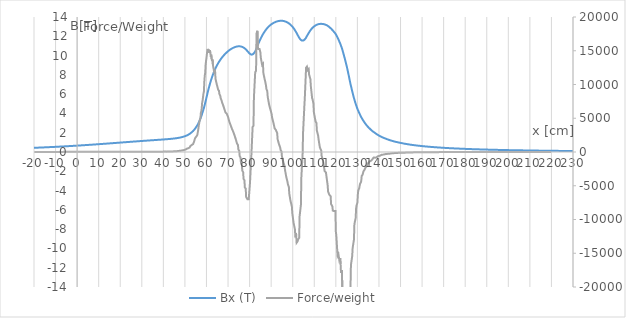
| Category | Bx (T) |
|---|---|
| -20.0 | 0.434 |
| -19.799999 | 0.436 |
| -19.6 | 0.438 |
| -19.4 | 0.44 |
| -19.200001 | 0.442 |
| -19.0 | 0.444 |
| -18.799999 | 0.446 |
| -18.6 | 0.447 |
| -18.4 | 0.449 |
| -18.200001 | 0.451 |
| -18.0 | 0.453 |
| -17.799999 | 0.455 |
| -17.6 | 0.457 |
| -17.4 | 0.459 |
| -17.200001 | 0.461 |
| -17.0 | 0.463 |
| -16.799999 | 0.465 |
| -16.6 | 0.467 |
| -16.4 | 0.469 |
| -16.200001 | 0.471 |
| -16.0 | 0.472 |
| -15.8 | 0.474 |
| -15.6 | 0.476 |
| -15.404266 | 0.478 |
| -15.2 | 0.48 |
| -15.0 | 0.483 |
| -14.8 | 0.485 |
| -14.6 | 0.487 |
| -14.4 | 0.489 |
| -14.2 | 0.49 |
| -14.0 | 0.493 |
| -13.8 | 0.495 |
| -13.6 | 0.497 |
| -13.4 | 0.499 |
| -13.2 | 0.501 |
| -12.999469 | 0.503 |
| -12.8 | 0.505 |
| -12.599999 | 0.507 |
| -12.4 | 0.51 |
| -12.2 | 0.512 |
| -12.0 | 0.514 |
| -11.8 | 0.516 |
| -11.599999 | 0.518 |
| -11.4 | 0.52 |
| -11.2 | 0.522 |
| -11.0 | 0.525 |
| -10.8 | 0.527 |
| -10.599999 | 0.529 |
| -10.4 | 0.531 |
| -10.2 | 0.534 |
| -10.0 | 0.536 |
| -9.8000002 | 0.538 |
| -9.5999994 | 0.54 |
| -9.3999996 | 0.543 |
| -9.1999998 | 0.545 |
| -9.0 | 0.547 |
| -8.8000002 | 0.55 |
| -8.5998316 | 0.552 |
| -8.3999996 | 0.554 |
| -8.1999998 | 0.557 |
| -8.0 | 0.559 |
| -7.7999997 | 0.561 |
| -7.5980721 | 0.564 |
| -7.3999996 | 0.566 |
| -7.1999998 | 0.568 |
| -7.0 | 0.571 |
| -6.7999997 | 0.573 |
| -6.5999999 | 0.576 |
| -6.3999996 | 0.578 |
| -6.1999998 | 0.58 |
| -6.0 | 0.583 |
| -5.7999997 | 0.585 |
| -5.5999999 | 0.588 |
| -5.3999996 | 0.59 |
| -5.1999998 | 0.593 |
| -5.0 | 0.595 |
| -4.7999997 | 0.598 |
| -4.5999999 | 0.6 |
| -4.3999996 | 0.603 |
| -4.1999998 | 0.605 |
| -3.9999998 | 0.608 |
| -3.7999997 | 0.611 |
| -3.5999997 | 0.613 |
| -3.3999999 | 0.616 |
| -3.1999998 | 0.618 |
| -2.9999998 | 0.621 |
| -2.7999997 | 0.623 |
| -2.5999997 | 0.626 |
| -2.3999996 | 0.629 |
| -2.1999998 | 0.631 |
| -1.9999998 | 0.634 |
| -1.7999997 | 0.637 |
| -1.5999997 | 0.639 |
| -1.3999997 | 0.642 |
| -1.1999997 | 0.645 |
| -0.9999997 | 0.647 |
| -0.79999971 | 0.65 |
| -0.59999973 | 0.653 |
| -0.39999971 | 0.655 |
| -0.1999997 | 0.658 |
| 0.0 | 0.661 |
| 0.2000003 | 0.664 |
| 0.4000003 | 0.666 |
| 0.60000032 | 0.669 |
| 0.80000031 | 0.672 |
| 1.0000004 | 0.675 |
| 1.2000003 | 0.678 |
| 1.4000003 | 0.68 |
| 1.6000004 | 0.683 |
| 1.8000003 | 0.686 |
| 2.0000002 | 0.689 |
| 2.2000003 | 0.692 |
| 2.4000003 | 0.695 |
| 2.6000004 | 0.697 |
| 2.8000004 | 0.7 |
| 3.0000002 | 0.703 |
| 3.2000003 | 0.706 |
| 3.4000003 | 0.709 |
| 3.6000004 | 0.712 |
| 3.8000004 | 0.715 |
| 4.0000005 | 0.718 |
| 4.2000003 | 0.721 |
| 4.4000006 | 0.724 |
| 4.6000004 | 0.727 |
| 4.8000002 | 0.73 |
| 4.9998217 | 0.733 |
| 5.2000003 | 0.736 |
| 5.4000006 | 0.739 |
| 5.6000004 | 0.742 |
| 5.8000002 | 0.745 |
| 6.0000005 | 0.748 |
| 6.2000003 | 0.751 |
| 6.4000006 | 0.754 |
| 6.6000004 | 0.757 |
| 6.8000002 | 0.76 |
| 7.0000005 | 0.763 |
| 7.2000003 | 0.766 |
| 7.4000006 | 0.769 |
| 7.6000004 | 0.772 |
| 7.8000002 | 0.775 |
| 8.0 | 0.778 |
| 8.2000008 | 0.781 |
| 8.4000006 | 0.784 |
| 8.6000004 | 0.788 |
| 8.8000002 | 0.791 |
| 9.0 | 0.794 |
| 9.2000008 | 0.797 |
| 9.4000006 | 0.801 |
| 9.6000004 | 0.804 |
| 9.8000002 | 0.807 |
| 10.0 | 0.81 |
| 10.200001 | 0.813 |
| 10.400001 | 0.816 |
| 10.6 | 0.819 |
| 10.8 | 0.823 |
| 11.0 | 0.826 |
| 11.200001 | 0.829 |
| 11.400001 | 0.832 |
| 11.6 | 0.835 |
| 11.8 | 0.839 |
| 12.0 | 0.842 |
| 12.200001 | 0.845 |
| 12.400001 | 0.848 |
| 12.6 | 0.852 |
| 12.8 | 0.855 |
| 13.000001 | 0.858 |
| 13.202733 | 0.862 |
| 13.400001 | 0.865 |
| 13.6 | 0.868 |
| 13.8 | 0.872 |
| 14.000001 | 0.875 |
| 14.200001 | 0.878 |
| 14.400001 | 0.882 |
| 14.6 | 0.885 |
| 14.8 | 0.888 |
| 15.000001 | 0.892 |
| 15.200001 | 0.895 |
| 15.400001 | 0.899 |
| 15.6 | 0.902 |
| 15.8 | 0.905 |
| 16.0 | 0.908 |
| 16.200001 | 0.912 |
| 16.4 | 0.915 |
| 16.6 | 0.918 |
| 16.800001 | 0.922 |
| 17.0 | 0.925 |
| 17.200001 | 0.928 |
| 17.4 | 0.932 |
| 17.6 | 0.935 |
| 17.800001 | 0.939 |
| 18.0 | 0.942 |
| 18.200001 | 0.946 |
| 18.400002 | 0.949 |
| 18.6 | 0.952 |
| 18.800001 | 0.956 |
| 19.0 | 0.959 |
| 19.200001 | 0.962 |
| 19.400002 | 0.965 |
| 19.6 | 0.969 |
| 19.800001 | 0.973 |
| 20.0 | 0.976 |
| 20.200001 | 0.979 |
| 20.400002 | 0.983 |
| 20.6 | 0.986 |
| 20.800001 | 0.989 |
| 21.0 | 0.993 |
| 21.200001 | 0.996 |
| 21.400002 | 0.999 |
| 21.6 | 1.003 |
| 21.800001 | 1.006 |
| 22.0 | 1.01 |
| 22.200001 | 1.013 |
| 22.400002 | 1.017 |
| 22.6 | 1.02 |
| 22.800001 | 1.023 |
| 23.0 | 1.027 |
| 23.200001 | 1.03 |
| 23.400002 | 1.033 |
| 23.6 | 1.036 |
| 23.800001 | 1.04 |
| 24.0 | 1.043 |
| 24.200001 | 1.047 |
| 24.400002 | 1.05 |
| 24.6 | 1.054 |
| 24.800001 | 1.057 |
| 25.0 | 1.06 |
| 25.200001 | 1.064 |
| 25.400002 | 1.067 |
| 25.603199 | 1.07 |
| 25.800001 | 1.074 |
| 26.0 | 1.077 |
| 26.200001 | 1.081 |
| 26.400002 | 1.084 |
| 26.6 | 1.087 |
| 26.800001 | 1.09 |
| 27.0 | 1.093 |
| 27.200001 | 1.097 |
| 27.400002 | 1.1 |
| 27.6 | 1.103 |
| 27.800001 | 1.107 |
| 28.0 | 1.11 |
| 28.200001 | 1.114 |
| 28.400002 | 1.117 |
| 28.6 | 1.12 |
| 28.800001 | 1.123 |
| 29.0 | 1.126 |
| 29.200001 | 1.13 |
| 29.400002 | 1.133 |
| 29.6 | 1.136 |
| 29.800001 | 1.14 |
| 30.0 | 1.143 |
| 30.200001 | 1.146 |
| 30.400002 | 1.149 |
| 30.6 | 1.153 |
| 30.800001 | 1.156 |
| 31.0 | 1.159 |
| 31.200001 | 1.162 |
| 31.400002 | 1.165 |
| 31.6 | 1.168 |
| 31.800001 | 1.171 |
| 32.0 | 1.175 |
| 32.200001 | 1.178 |
| 32.400002 | 1.181 |
| 32.600002 | 1.184 |
| 32.799999 | 1.187 |
| 33.0 | 1.191 |
| 33.200001 | 1.194 |
| 33.400002 | 1.197 |
| 33.600002 | 1.2 |
| 33.799999 | 1.203 |
| 34.0 | 1.206 |
| 34.200001 | 1.209 |
| 34.400002 | 1.212 |
| 34.600002 | 1.215 |
| 34.799999 | 1.219 |
| 35.0 | 1.222 |
| 35.200001 | 1.225 |
| 35.400002 | 1.228 |
| 35.600002 | 1.231 |
| 35.799999 | 1.234 |
| 36.0 | 1.237 |
| 36.200001 | 1.24 |
| 36.400002 | 1.243 |
| 36.600002 | 1.246 |
| 36.799999 | 1.249 |
| 37.0 | 1.252 |
| 37.200001 | 1.256 |
| 37.400002 | 1.259 |
| 37.600002 | 1.262 |
| 37.801914 | 1.265 |
| 38.0 | 1.268 |
| 38.200001 | 1.271 |
| 38.400002 | 1.274 |
| 38.600002 | 1.277 |
| 38.799999 | 1.28 |
| 39.0 | 1.283 |
| 39.200001 | 1.287 |
| 39.400002 | 1.29 |
| 39.600002 | 1.293 |
| 39.799999 | 1.296 |
| 40.0 | 1.299 |
| 40.200001 | 1.302 |
| 40.400002 | 1.306 |
| 40.600002 | 1.31 |
| 40.799999 | 1.313 |
| 41.0 | 1.317 |
| 41.200001 | 1.32 |
| 41.400002 | 1.323 |
| 41.600002 | 1.326 |
| 41.799999 | 1.33 |
| 42.0 | 1.334 |
| 42.200001 | 1.337 |
| 42.400002 | 1.341 |
| 42.600002 | 1.345 |
| 42.799999 | 1.35 |
| 43.0 | 1.353 |
| 43.200001 | 1.357 |
| 43.400002 | 1.362 |
| 43.600002 | 1.366 |
| 43.799999 | 1.371 |
| 44.0 | 1.375 |
| 44.200001 | 1.38 |
| 44.400002 | 1.385 |
| 44.600002 | 1.39 |
| 44.799999 | 1.395 |
| 45.0 | 1.401 |
| 45.200001 | 1.406 |
| 45.400002 | 1.412 |
| 45.600002 | 1.417 |
| 45.799999 | 1.423 |
| 46.0 | 1.429 |
| 46.200001 | 1.436 |
| 46.400002 | 1.442 |
| 46.600002 | 1.449 |
| 46.799999 | 1.457 |
| 47.0 | 1.465 |
| 47.200001 | 1.473 |
| 47.400002 | 1.481 |
| 47.600002 | 1.49 |
| 47.799999 | 1.499 |
| 48.0 | 1.509 |
| 48.194988 | 1.519 |
| 48.400002 | 1.53 |
| 48.600002 | 1.542 |
| 48.799999 | 1.554 |
| 49.0 | 1.566 |
| 49.200001 | 1.579 |
| 49.400002 | 1.593 |
| 49.600002 | 1.608 |
| 49.799999 | 1.623 |
| 50.0 | 1.639 |
| 50.200001 | 1.655 |
| 50.400002 | 1.672 |
| 50.600002 | 1.69 |
| 50.799999 | 1.708 |
| 51.0 | 1.731 |
| 51.200001 | 1.753 |
| 51.400002 | 1.776 |
| 51.600002 | 1.8 |
| 51.799999 | 1.824 |
| 52.0 | 1.851 |
| 52.200001 | 1.879 |
| 52.400002 | 1.91 |
| 52.600002 | 1.945 |
| 52.799999 | 1.981 |
| 53.0 | 2.019 |
| 53.200001 | 2.057 |
| 53.400002 | 2.096 |
| 53.600002 | 2.137 |
| 53.799999 | 2.178 |
| 54.0 | 2.224 |
| 54.200001 | 2.274 |
| 54.400002 | 2.324 |
| 54.600002 | 2.385 |
| 54.799999 | 2.45 |
| 55.0 | 2.515 |
| 55.200001 | 2.582 |
| 55.400002 | 2.649 |
| 55.600002 | 2.717 |
| 55.799999 | 2.788 |
| 56.0 | 2.859 |
| 56.200001 | 2.946 |
| 56.400002 | 3.043 |
| 56.600002 | 3.14 |
| 56.800003 | 3.248 |
| 57.0 | 3.357 |
| 57.200001 | 3.468 |
| 57.400002 | 3.591 |
| 57.600002 | 3.715 |
| 57.800003 | 3.843 |
| 58.0 | 3.984 |
| 58.200001 | 4.124 |
| 58.400002 | 4.269 |
| 58.600002 | 4.418 |
| 58.800003 | 4.567 |
| 59.0 | 4.734 |
| 59.200001 | 4.91 |
| 59.400002 | 5.085 |
| 59.600002 | 5.271 |
| 59.800003 | 5.459 |
| 60.000004 | 5.647 |
| 60.200001 | 5.837 |
| 60.400002 | 6.026 |
| 60.600002 | 6.214 |
| 60.800003 | 6.389 |
| 61.0 | 6.565 |
| 61.200001 | 6.737 |
| 61.400002 | 6.899 |
| 61.600002 | 7.061 |
| 61.800003 | 7.216 |
| 62.0 | 7.362 |
| 62.200001 | 7.508 |
| 62.400002 | 7.646 |
| 62.600002 | 7.778 |
| 62.800003 | 7.91 |
| 63.0 | 8.031 |
| 63.200001 | 8.15 |
| 63.400002 | 8.269 |
| 63.600002 | 8.376 |
| 63.800003 | 8.482 |
| 63.995033 | 8.586 |
| 64.200005 | 8.683 |
| 64.400002 | 8.778 |
| 64.599998 | 8.871 |
| 64.800003 | 8.956 |
| 65.0 | 9.041 |
| 65.200005 | 9.124 |
| 65.400002 | 9.201 |
| 65.599998 | 9.277 |
| 65.800003 | 9.351 |
| 66.0 | 9.42 |
| 66.200005 | 9.489 |
| 66.400002 | 9.556 |
| 66.599998 | 9.619 |
| 66.800003 | 9.682 |
| 67.0 | 9.741 |
| 67.200005 | 9.799 |
| 67.400002 | 9.856 |
| 67.599998 | 9.91 |
| 67.800003 | 9.963 |
| 68.0 | 10.015 |
| 68.200005 | 10.064 |
| 68.400002 | 10.111 |
| 68.599998 | 10.159 |
| 68.800003 | 10.203 |
| 69.0 | 10.246 |
| 69.200005 | 10.289 |
| 69.400002 | 10.331 |
| 69.599998 | 10.372 |
| 69.800003 | 10.414 |
| 70.0 | 10.452 |
| 70.200005 | 10.49 |
| 70.399872 | 10.527 |
| 70.599998 | 10.56 |
| 70.800003 | 10.592 |
| 71.0 | 10.624 |
| 71.200005 | 10.653 |
| 71.400002 | 10.681 |
| 71.599998 | 10.709 |
| 71.800003 | 10.734 |
| 72.0 | 10.758 |
| 72.200005 | 10.782 |
| 72.400002 | 10.803 |
| 72.599998 | 10.825 |
| 72.800003 | 10.845 |
| 73.0 | 10.863 |
| 73.200005 | 10.88 |
| 73.400002 | 10.896 |
| 73.599998 | 10.91 |
| 73.800003 | 10.923 |
| 74.0 | 10.935 |
| 74.200005 | 10.943 |
| 74.400002 | 10.952 |
| 74.599998 | 10.959 |
| 74.800003 | 10.962 |
| 75.0 | 10.964 |
| 75.200005 | 10.965 |
| 75.400002 | 10.961 |
| 75.599998 | 10.957 |
| 75.800003 | 10.951 |
| 76.0 | 10.94 |
| 76.200005 | 10.928 |
| 76.400002 | 10.915 |
| 76.599998 | 10.896 |
| 76.800003 | 10.877 |
| 77.0 | 10.856 |
| 77.200005 | 10.828 |
| 77.400002 | 10.8 |
| 77.599998 | 10.77 |
| 77.800003 | 10.733 |
| 78.0 | 10.695 |
| 78.200005 | 10.657 |
| 78.400002 | 10.609 |
| 78.599998 | 10.561 |
| 78.800003 | 10.513 |
| 79.0 | 10.462 |
| 79.200005 | 10.411 |
| 79.400002 | 10.36 |
| 79.599998 | 10.308 |
| 79.800003 | 10.256 |
| 80.000008 | 10.205 |
| 80.200005 | 10.171 |
| 80.400002 | 10.138 |
| 80.595566 | 10.105 |
| 80.800003 | 10.1 |
| 81.0 | 10.096 |
| 81.200005 | 10.092 |
| 81.400002 | 10.12 |
| 81.599998 | 10.148 |
| 81.800003 | 10.177 |
| 82.0 | 10.237 |
| 82.200005 | 10.297 |
| 82.395538 | 10.355 |
| 82.599998 | 10.443 |
| 82.800003 | 10.529 |
| 83.000008 | 10.616 |
| 83.200005 | 10.74 |
| 83.400002 | 10.865 |
| 83.599998 | 10.989 |
| 83.800003 | 11.096 |
| 84.0 | 11.2 |
| 84.200005 | 11.304 |
| 84.400002 | 11.406 |
| 84.599998 | 11.507 |
| 84.800003 | 11.608 |
| 85.0 | 11.704 |
| 85.200005 | 11.794 |
| 85.400002 | 11.884 |
| 85.599998 | 11.972 |
| 85.800003 | 12.054 |
| 86.0 | 12.135 |
| 86.19445 | 12.215 |
| 86.400002 | 12.289 |
| 86.599998 | 12.361 |
| 86.800003 | 12.434 |
| 87.0 | 12.499 |
| 87.200005 | 12.563 |
| 87.400002 | 12.627 |
| 87.599998 | 12.686 |
| 87.800003 | 12.742 |
| 88.0 | 12.798 |
| 88.200005 | 12.851 |
| 88.400002 | 12.899 |
| 88.599998 | 12.948 |
| 88.800003 | 12.996 |
| 89.0 | 13.037 |
| 89.200005 | 13.079 |
| 89.400002 | 13.12 |
| 89.599998 | 13.157 |
| 89.800003 | 13.192 |
| 90.0 | 13.228 |
| 90.200005 | 13.26 |
| 90.400002 | 13.29 |
| 90.599998 | 13.319 |
| 90.800003 | 13.348 |
| 91.0 | 13.373 |
| 91.200005 | 13.398 |
| 91.400002 | 13.423 |
| 91.599998 | 13.443 |
| 91.800003 | 13.463 |
| 92.0 | 13.482 |
| 92.200005 | 13.5 |
| 92.400002 | 13.518 |
| 92.599998 | 13.536 |
| 92.800003 | 13.551 |
| 93.0 | 13.562 |
| 93.200005 | 13.572 |
| 93.400002 | 13.583 |
| 93.599998 | 13.59 |
| 93.800003 | 13.596 |
| 94.0 | 13.602 |
| 94.200005 | 13.606 |
| 94.400002 | 13.607 |
| 94.599998 | 13.609 |
| 94.800003 | 13.609 |
| 95.0 | 13.606 |
| 95.200005 | 13.602 |
| 95.400002 | 13.599 |
| 95.599998 | 13.59 |
| 95.800003 | 13.581 |
| 96.0 | 13.572 |
| 96.200005 | 13.561 |
| 96.400002 | 13.546 |
| 96.599998 | 13.531 |
| 96.800003 | 13.516 |
| 97.0 | 13.495 |
| 97.200005 | 13.475 |
| 97.400002 | 13.454 |
| 97.599998 | 13.428 |
| 97.800003 | 13.401 |
| 98.0 | 13.373 |
| 98.200005 | 13.344 |
| 98.400002 | 13.309 |
| 98.599998 | 13.274 |
| 98.800003 | 13.239 |
| 99.0 | 13.197 |
| 99.200005 | 13.153 |
| 99.400002 | 13.11 |
| 99.599998 | 13.062 |
| 99.800003 | 13.01 |
| 100.0 | 12.957 |
| 100.2 | 12.904 |
| 100.4 | 12.841 |
| 100.6 | 12.778 |
| 100.8 | 12.715 |
| 101.0 | 12.646 |
| 101.2 | 12.571 |
| 101.4 | 12.496 |
| 101.60283 | 12.42 |
| 101.8 | 12.338 |
| 102.0 | 12.255 |
| 102.2 | 12.172 |
| 102.4 | 12.089 |
| 102.6 | 12.008 |
| 102.8 | 11.926 |
| 103.00001 | 11.844 |
| 103.2 | 11.783 |
| 103.4 | 11.721 |
| 103.6 | 11.66 |
| 103.8 | 11.608 |
| 104.0 | 11.584 |
| 104.2 | 11.559 |
| 104.4 | 11.534 |
| 104.6 | 11.532 |
| 104.8 | 11.551 |
| 105.0 | 11.57 |
| 105.2 | 11.589 |
| 105.4 | 11.634 |
| 105.6 | 11.685 |
| 105.8 | 11.737 |
| 106.00001 | 11.789 |
| 106.2 | 11.869 |
| 106.4 | 11.949 |
| 106.6 | 12.029 |
| 106.8 | 12.107 |
| 107.0 | 12.183 |
| 107.2 | 12.259 |
| 107.40306 | 12.336 |
| 107.6 | 12.406 |
| 107.8 | 12.476 |
| 108.0 | 12.546 |
| 108.2 | 12.612 |
| 108.4 | 12.67 |
| 108.6 | 12.729 |
| 108.8 | 12.788 |
| 109.0 | 12.835 |
| 109.2 | 12.881 |
| 109.4 | 12.927 |
| 109.6 | 12.969 |
| 109.8 | 13.004 |
| 110.0 | 13.039 |
| 110.2 | 13.073 |
| 110.4 | 13.102 |
| 110.6 | 13.128 |
| 110.8 | 13.154 |
| 111.0 | 13.179 |
| 111.2 | 13.197 |
| 111.4 | 13.215 |
| 111.6 | 13.234 |
| 111.8 | 13.248 |
| 112.0 | 13.258 |
| 112.2 | 13.269 |
| 112.4 | 13.28 |
| 112.6 | 13.284 |
| 112.8 | 13.287 |
| 113.0 | 13.29 |
| 113.2 | 13.292 |
| 113.4 | 13.288 |
| 113.6 | 13.285 |
| 113.8 | 13.282 |
| 114.0 | 13.275 |
| 114.2 | 13.266 |
| 114.4 | 13.257 |
| 114.60249 | 13.248 |
| 114.8 | 13.232 |
| 115.0 | 13.215 |
| 115.2 | 13.199 |
| 115.4 | 13.182 |
| 115.6 | 13.161 |
| 115.8 | 13.141 |
| 116.0 | 13.121 |
| 116.2 | 13.092 |
| 116.4 | 13.058 |
| 116.6 | 13.024 |
| 116.8 | 12.99 |
| 117.0 | 12.953 |
| 117.2 | 12.915 |
| 117.4 | 12.877 |
| 117.6 | 12.838 |
| 117.8 | 12.792 |
| 118.0 | 12.746 |
| 118.2 | 12.7 |
| 118.4 | 12.652 |
| 118.6 | 12.599 |
| 118.8 | 12.547 |
| 119.0 | 12.494 |
| 119.2 | 12.441 |
| 119.4 | 12.386 |
| 119.6 | 12.332 |
| 119.8 | 12.278 |
| 120.0 | 12.204 |
| 120.2 | 12.127 |
| 120.4 | 12.05 |
| 120.6 | 11.972 |
| 120.8 | 11.873 |
| 121.0 | 11.774 |
| 121.2 | 11.676 |
| 121.4 | 11.575 |
| 121.6 | 11.469 |
| 121.8 | 11.363 |
| 122.0 | 11.256 |
| 122.2 | 11.143 |
| 122.4 | 11.019 |
| 122.6 | 10.895 |
| 122.8 | 10.772 |
| 123.0 | 10.628 |
| 123.2 | 10.467 |
| 123.4 | 10.307 |
| 123.6 | 10.147 |
| 123.8 | 9.982 |
| 124.0 | 9.815 |
| 124.2 | 9.648 |
| 124.4 | 9.481 |
| 124.6 | 9.3 |
| 124.8 | 9.117 |
| 125.0 | 8.933 |
| 125.2 | 8.749 |
| 125.4 | 8.542 |
| 125.6 | 8.333 |
| 125.8 | 8.123 |
| 125.99998 | 7.914 |
| 126.2 | 7.697 |
| 126.4 | 7.479 |
| 126.6 | 7.262 |
| 126.79456 | 7.051 |
| 127.0 | 6.86 |
| 127.2 | 6.674 |
| 127.4 | 6.488 |
| 127.59848 | 6.303 |
| 127.8 | 6.125 |
| 128.0 | 5.948 |
| 128.2 | 5.772 |
| 128.40001 | 5.595 |
| 128.60001 | 5.444 |
| 128.8 | 5.295 |
| 129.0 | 5.146 |
| 129.2 | 4.997 |
| 129.40001 | 4.866 |
| 129.60001 | 4.738 |
| 129.8 | 4.611 |
| 130.0 | 4.483 |
| 130.2 | 4.373 |
| 130.40001 | 4.272 |
| 130.60001 | 4.17 |
| 130.8 | 4.069 |
| 131.0 | 3.971 |
| 131.2 | 3.878 |
| 131.40001 | 3.785 |
| 131.60001 | 3.692 |
| 131.8 | 3.602 |
| 132.0 | 3.526 |
| 132.2 | 3.45 |
| 132.40001 | 3.374 |
| 132.60001 | 3.298 |
| 132.8 | 3.23 |
| 133.0 | 3.163 |
| 133.2 | 3.097 |
| 133.40001 | 3.031 |
| 133.60001 | 2.968 |
| 133.8 | 2.909 |
| 134.0 | 2.849 |
| 134.2 | 2.79 |
| 134.40001 | 2.732 |
| 134.60001 | 2.683 |
| 134.8 | 2.635 |
| 135.0 | 2.586 |
| 135.2 | 2.537 |
| 135.40001 | 2.492 |
| 135.60001 | 2.448 |
| 135.8 | 2.405 |
| 136.0 | 2.361 |
| 136.2 | 2.318 |
| 136.40001 | 2.278 |
| 136.60001 | 2.238 |
| 136.8 | 2.198 |
| 137.0 | 2.158 |
| 137.2 | 2.124 |
| 137.40001 | 2.094 |
| 137.60001 | 2.064 |
| 137.8 | 2.034 |
| 138.0 | 2.005 |
| 138.2 | 1.972 |
| 138.40001 | 1.939 |
| 138.60001 | 1.906 |
| 138.8 | 1.874 |
| 139.0 | 1.842 |
| 139.2 | 1.814 |
| 139.40001 | 1.786 |
| 139.60001 | 1.759 |
| 139.8 | 1.731 |
| 140.0 | 1.705 |
| 140.2 | 1.68 |
| 140.40001 | 1.655 |
| 140.60001 | 1.63 |
| 140.8 | 1.605 |
| 141.0 | 1.583 |
| 141.2 | 1.563 |
| 141.40001 | 1.543 |
| 141.60001 | 1.523 |
| 141.8 | 1.503 |
| 142.0 | 1.484 |
| 142.2 | 1.466 |
| 142.40001 | 1.447 |
| 142.60001 | 1.428 |
| 142.80551 | 1.409 |
| 143.0 | 1.392 |
| 143.2 | 1.375 |
| 143.40001 | 1.358 |
| 143.60001 | 1.342 |
| 143.79761 | 1.325 |
| 144.0 | 1.309 |
| 144.2 | 1.293 |
| 144.40001 | 1.278 |
| 144.60001 | 1.262 |
| 144.80138 | 1.246 |
| 145.0 | 1.232 |
| 145.2 | 1.217 |
| 145.40001 | 1.203 |
| 145.60001 | 1.188 |
| 145.8 | 1.174 |
| 146.0 | 1.161 |
| 146.2 | 1.149 |
| 146.40001 | 1.136 |
| 146.60001 | 1.124 |
| 146.8 | 1.111 |
| 147.0 | 1.1 |
| 147.2 | 1.088 |
| 147.40001 | 1.077 |
| 147.60001 | 1.065 |
| 147.8 | 1.054 |
| 148.0 | 1.043 |
| 148.2 | 1.034 |
| 148.40001 | 1.024 |
| 148.60001 | 1.014 |
| 148.8 | 1.004 |
| 149.0 | 0.994 |
| 149.2 | 0.984 |
| 149.40001 | 0.974 |
| 149.60001 | 0.964 |
| 149.8 | 0.954 |
| 150.0 | 0.944 |
| 150.2 | 0.936 |
| 150.40001 | 0.927 |
| 150.60001 | 0.919 |
| 150.8 | 0.91 |
| 151.0 | 0.902 |
| 151.2 | 0.893 |
| 151.40001 | 0.883 |
| 151.60001 | 0.874 |
| 151.8 | 0.865 |
| 152.0 | 0.855 |
| 152.2 | 0.846 |
| 152.40001 | 0.839 |
| 152.60001 | 0.832 |
| 152.8 | 0.825 |
| 153.0 | 0.818 |
| 153.2 | 0.811 |
| 153.40001 | 0.804 |
| 153.60001 | 0.796 |
| 153.8 | 0.788 |
| 154.0 | 0.781 |
| 154.2 | 0.773 |
| 154.40001 | 0.765 |
| 154.60001 | 0.759 |
| 154.8 | 0.753 |
| 155.0 | 0.747 |
| 155.2 | 0.741 |
| 155.40001 | 0.735 |
| 155.60001 | 0.729 |
| 155.8 | 0.723 |
| 156.0 | 0.717 |
| 156.2 | 0.712 |
| 156.40001 | 0.706 |
| 156.60001 | 0.7 |
| 156.8 | 0.694 |
| 157.0 | 0.688 |
| 157.2 | 0.683 |
| 157.40001 | 0.677 |
| 157.60001 | 0.672 |
| 157.8 | 0.666 |
| 158.0 | 0.661 |
| 158.2 | 0.656 |
| 158.40001 | 0.651 |
| 158.60001 | 0.647 |
| 158.8 | 0.642 |
| 159.0 | 0.637 |
| 159.2 | 0.633 |
| 159.40001 | 0.628 |
| 159.60001 | 0.623 |
| 159.8 | 0.618 |
| 160.0 | 0.613 |
| 160.2 | 0.608 |
| 160.40001 | 0.603 |
| 160.60001 | 0.598 |
| 160.8 | 0.593 |
| 161.0 | 0.589 |
| 161.2 | 0.585 |
| 161.40001 | 0.581 |
| 161.60001 | 0.577 |
| 161.8 | 0.573 |
| 162.0005 | 0.568 |
| 162.2 | 0.564 |
| 162.40001 | 0.561 |
| 162.60001 | 0.557 |
| 162.8 | 0.553 |
| 163.0 | 0.549 |
| 163.2 | 0.545 |
| 163.40001 | 0.541 |
| 163.60001 | 0.537 |
| 163.8 | 0.534 |
| 164.0 | 0.53 |
| 164.2 | 0.526 |
| 164.40001 | 0.523 |
| 164.60001 | 0.519 |
| 164.8 | 0.515 |
| 165.0 | 0.512 |
| 165.2 | 0.509 |
| 165.40001 | 0.505 |
| 165.60001 | 0.502 |
| 165.8 | 0.498 |
| 166.0 | 0.495 |
| 166.2 | 0.492 |
| 166.40001 | 0.488 |
| 166.60001 | 0.485 |
| 166.8 | 0.482 |
| 167.0 | 0.479 |
| 167.2 | 0.475 |
| 167.40001 | 0.472 |
| 167.60001 | 0.469 |
| 167.8 | 0.466 |
| 168.0 | 0.463 |
| 168.2 | 0.46 |
| 168.40001 | 0.458 |
| 168.60001 | 0.455 |
| 168.8 | 0.452 |
| 169.0 | 0.449 |
| 169.2 | 0.446 |
| 169.40001 | 0.443 |
| 169.60001 | 0.441 |
| 169.8 | 0.438 |
| 170.0 | 0.435 |
| 170.2 | 0.432 |
| 170.40001 | 0.429 |
| 170.60001 | 0.426 |
| 170.8 | 0.424 |
| 171.0 | 0.421 |
| 171.2 | 0.418 |
| 171.40001 | 0.416 |
| 171.60001 | 0.413 |
| 171.8 | 0.411 |
| 172.0 | 0.408 |
| 172.1994 | 0.405 |
| 172.40001 | 0.403 |
| 172.60001 | 0.401 |
| 172.8 | 0.398 |
| 173.0 | 0.396 |
| 173.2 | 0.394 |
| 173.40001 | 0.391 |
| 173.60001 | 0.389 |
| 173.79482 | 0.387 |
| 174.0 | 0.384 |
| 174.2 | 0.382 |
| 174.40001 | 0.38 |
| 174.60001 | 0.378 |
| 174.8 | 0.375 |
| 175.0 | 0.373 |
| 175.2 | 0.371 |
| 175.40001 | 0.368 |
| 175.60001 | 0.366 |
| 175.8 | 0.364 |
| 176.0 | 0.363 |
| 176.2 | 0.361 |
| 176.40001 | 0.359 |
| 176.60001 | 0.357 |
| 176.8 | 0.355 |
| 177.0 | 0.353 |
| 177.2 | 0.351 |
| 177.40001 | 0.349 |
| 177.60001 | 0.347 |
| 177.8 | 0.345 |
| 178.0 | 0.343 |
| 178.2 | 0.341 |
| 178.40001 | 0.339 |
| 178.60001 | 0.337 |
| 178.80684 | 0.335 |
| 179.0 | 0.334 |
| 179.2 | 0.332 |
| 179.40001 | 0.33 |
| 179.60001 | 0.328 |
| 179.8 | 0.326 |
| 180.0 | 0.324 |
| 180.2 | 0.322 |
| 180.40001 | 0.321 |
| 180.60001 | 0.319 |
| 180.8 | 0.317 |
| 181.0 | 0.315 |
| 181.2 | 0.313 |
| 181.40001 | 0.312 |
| 181.60001 | 0.31 |
| 181.8 | 0.308 |
| 182.0 | 0.307 |
| 182.2 | 0.305 |
| 182.40001 | 0.303 |
| 182.60001 | 0.302 |
| 182.8 | 0.3 |
| 183.0 | 0.298 |
| 183.2 | 0.297 |
| 183.40001 | 0.295 |
| 183.60001 | 0.294 |
| 183.8 | 0.292 |
| 184.0 | 0.291 |
| 184.2 | 0.289 |
| 184.40001 | 0.288 |
| 184.60001 | 0.286 |
| 184.8 | 0.285 |
| 185.0 | 0.283 |
| 185.2 | 0.282 |
| 185.40001 | 0.281 |
| 185.60001 | 0.279 |
| 185.8 | 0.278 |
| 186.0 | 0.276 |
| 186.2 | 0.275 |
| 186.40001 | 0.273 |
| 186.60001 | 0.272 |
| 186.8 | 0.271 |
| 187.0 | 0.269 |
| 187.2 | 0.268 |
| 187.40001 | 0.266 |
| 187.60001 | 0.265 |
| 187.8 | 0.264 |
| 188.0 | 0.262 |
| 188.2 | 0.261 |
| 188.40001 | 0.26 |
| 188.60001 | 0.258 |
| 188.8 | 0.257 |
| 189.0 | 0.256 |
| 189.2 | 0.254 |
| 189.40001 | 0.253 |
| 189.60001 | 0.252 |
| 189.8 | 0.251 |
| 190.0 | 0.249 |
| 190.2 | 0.248 |
| 190.40001 | 0.247 |
| 190.60001 | 0.246 |
| 190.8 | 0.245 |
| 191.0 | 0.243 |
| 191.2 | 0.242 |
| 191.40001 | 0.241 |
| 191.60001 | 0.24 |
| 191.8 | 0.239 |
| 192.0 | 0.238 |
| 192.2 | 0.236 |
| 192.40001 | 0.235 |
| 192.60001 | 0.234 |
| 192.8 | 0.233 |
| 193.0 | 0.232 |
| 193.2 | 0.231 |
| 193.40001 | 0.23 |
| 193.60001 | 0.229 |
| 193.8 | 0.228 |
| 193.9892 | 0.226 |
| 194.2 | 0.225 |
| 194.40001 | 0.224 |
| 194.60001 | 0.223 |
| 194.8 | 0.222 |
| 195.0 | 0.221 |
| 195.2 | 0.22 |
| 195.40001 | 0.219 |
| 195.60001 | 0.218 |
| 195.8 | 0.217 |
| 196.0 | 0.216 |
| 196.2 | 0.215 |
| 196.40001 | 0.214 |
| 196.60001 | 0.213 |
| 196.8 | 0.212 |
| 197.0 | 0.211 |
| 197.2 | 0.21 |
| 197.40001 | 0.209 |
| 197.60001 | 0.208 |
| 197.8 | 0.207 |
| 198.0 | 0.206 |
| 198.2 | 0.205 |
| 198.40001 | 0.204 |
| 198.60001 | 0.203 |
| 198.8 | 0.202 |
| 199.0 | 0.201 |
| 199.2 | 0.2 |
| 199.40001 | 0.199 |
| 199.60001 | 0.198 |
| 199.8 | 0.197 |
| 200.0 | 0.196 |
| 200.2 | 0.195 |
| 200.40001 | 0.194 |
| 200.60001 | 0.193 |
| 200.8 | 0.192 |
| 201.0 | 0.191 |
| 201.2 | 0.19 |
| 201.40001 | 0.189 |
| 201.60001 | 0.189 |
| 201.8 | 0.188 |
| 202.0 | 0.187 |
| 202.2 | 0.186 |
| 202.40001 | 0.185 |
| 202.60001 | 0.184 |
| 202.8 | 0.184 |
| 203.0 | 0.183 |
| 203.2 | 0.182 |
| 203.40001 | 0.181 |
| 203.60001 | 0.181 |
| 203.8 | 0.18 |
| 204.0 | 0.179 |
| 204.2 | 0.179 |
| 204.40001 | 0.178 |
| 204.60001 | 0.177 |
| 204.8 | 0.177 |
| 204.9957 | 0.176 |
| 205.2 | 0.175 |
| 205.40001 | 0.174 |
| 205.60001 | 0.173 |
| 205.8 | 0.172 |
| 206.0 | 0.172 |
| 206.2 | 0.171 |
| 206.40001 | 0.17 |
| 206.60001 | 0.169 |
| 206.8 | 0.168 |
| 207.0 | 0.167 |
| 207.2 | 0.166 |
| 207.40001 | 0.166 |
| 207.60001 | 0.165 |
| 207.8 | 0.164 |
| 208.0 | 0.163 |
| 208.2 | 0.163 |
| 208.40001 | 0.162 |
| 208.60001 | 0.161 |
| 208.8 | 0.161 |
| 209.0 | 0.16 |
| 209.2 | 0.159 |
| 209.40001 | 0.158 |
| 209.60001 | 0.158 |
| 209.8 | 0.157 |
| 210.0 | 0.156 |
| 210.2 | 0.156 |
| 210.40001 | 0.155 |
| 210.60001 | 0.154 |
| 210.8 | 0.153 |
| 211.0 | 0.153 |
| 211.2 | 0.152 |
| 211.40001 | 0.151 |
| 211.60001 | 0.151 |
| 211.8 | 0.15 |
| 212.0 | 0.149 |
| 212.2 | 0.149 |
| 212.40001 | 0.148 |
| 212.60001 | 0.147 |
| 212.8 | 0.147 |
| 213.0 | 0.146 |
| 213.2 | 0.145 |
| 213.40001 | 0.145 |
| 213.60001 | 0.144 |
| 213.8 | 0.143 |
| 214.0 | 0.143 |
| 214.2 | 0.142 |
| 214.40001 | 0.141 |
| 214.60001 | 0.141 |
| 214.8 | 0.14 |
| 215.0 | 0.14 |
| 215.2 | 0.139 |
| 215.40001 | 0.138 |
| 215.60001 | 0.138 |
| 215.8 | 0.137 |
| 216.0 | 0.137 |
| 216.2 | 0.136 |
| 216.40001 | 0.136 |
| 216.60001 | 0.135 |
| 216.8 | 0.135 |
| 217.0 | 0.134 |
| 217.2 | 0.133 |
| 217.40001 | 0.133 |
| 217.60001 | 0.132 |
| 217.8 | 0.132 |
| 218.0 | 0.131 |
| 218.2 | 0.131 |
| 218.40001 | 0.13 |
| 218.60001 | 0.129 |
| 218.8 | 0.129 |
| 219.0 | 0.128 |
| 219.2 | 0.128 |
| 219.40001 | 0.127 |
| 219.60001 | 0.127 |
| 219.8 | 0.126 |
| 219.98457 | 0.125 |
| 220.2 | 0.125 |
| 220.40001 | 0.124 |
| 220.60001 | 0.124 |
| 220.8 | 0.123 |
| 221.0 | 0.123 |
| 221.2 | 0.122 |
| 221.40001 | 0.122 |
| 221.60001 | 0.121 |
| 221.8 | 0.121 |
| 222.0 | 0.12 |
| 222.2 | 0.119 |
| 222.40001 | 0.119 |
| 222.60001 | 0.118 |
| 222.8 | 0.118 |
| 223.0 | 0.117 |
| 223.2 | 0.117 |
| 223.40001 | 0.116 |
| 223.60001 | 0.116 |
| 223.8 | 0.115 |
| 224.0 | 0.115 |
| 224.2 | 0.114 |
| 224.40001 | 0.114 |
| 224.60001 | 0.113 |
| 224.8 | 0.113 |
| 225.0 | 0.112 |
| 225.2 | 0.112 |
| 225.40001 | 0.111 |
| 225.60001 | 0.111 |
| 225.8 | 0.11 |
| 226.0 | 0.11 |
| 226.2 | 0.109 |
| 226.40001 | 0.109 |
| 226.60001 | 0.108 |
| 226.8 | 0.108 |
| 227.0 | 0.107 |
| 227.2 | 0.107 |
| 227.40001 | 0.106 |
| 227.60001 | 0.106 |
| 227.8 | 0.105 |
| 228.0 | 0.105 |
| 228.2 | 0.104 |
| 228.40001 | 0.104 |
| 228.60001 | 0.103 |
| 228.8 | 0.103 |
| 229.0 | 0.102 |
| 229.2 | 0.102 |
| 229.40001 | 0.102 |
| 229.60001 | 0.101 |
| 229.8 | 0.101 |
| 230.0 | 0.1 |